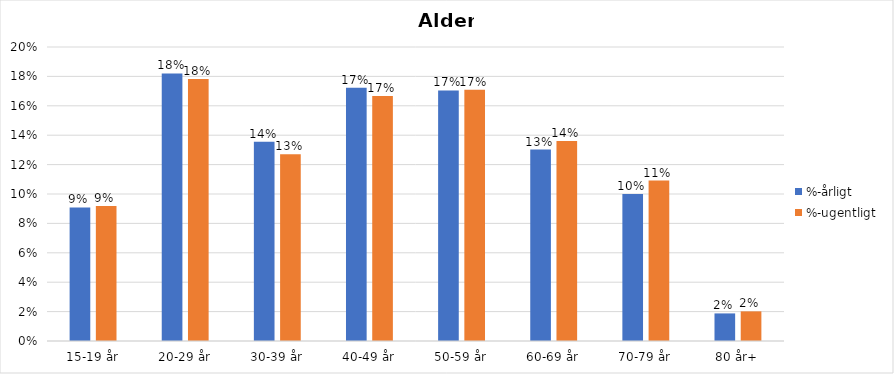
| Category | %-årligt | %-ugentligt |
|---|---|---|
| 15-19 år | 0.091 | 0.092 |
| 20-29 år | 0.182 | 0.178 |
| 30-39 år | 0.135 | 0.127 |
| 40-49 år | 0.172 | 0.167 |
| 50-59 år | 0.17 | 0.171 |
| 60-69 år | 0.13 | 0.136 |
| 70-79 år | 0.1 | 0.109 |
| 80 år+ | 0.019 | 0.02 |